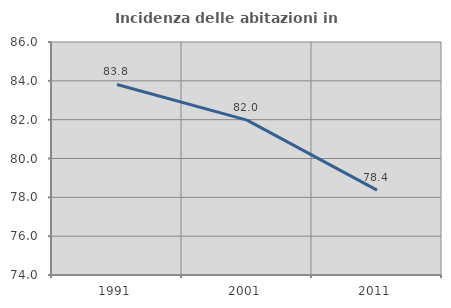
| Category | Incidenza delle abitazioni in proprietà  |
|---|---|
| 1991.0 | 83.814 |
| 2001.0 | 81.977 |
| 2011.0 | 78.374 |